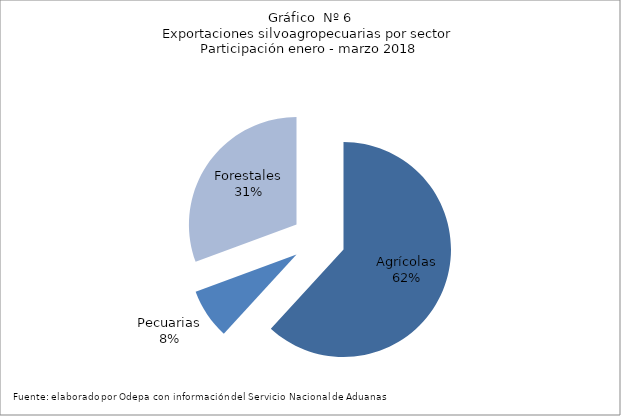
| Category | Series 0 |
|---|---|
| Agrícolas | 2974937 |
| Pecuarias | 363977 |
| Forestales | 1473565 |